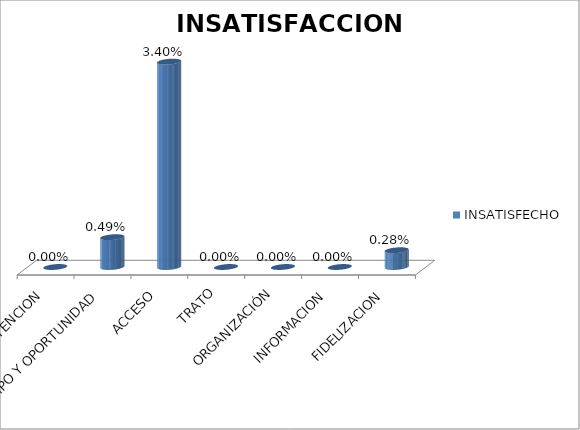
| Category | INSATISFECHO |
|---|---|
| ATENCION | 0 |
| TIEMPO Y OPORTUNIDAD | 0.005 |
| ACCESO | 0.034 |
| TRATO | 0 |
| ORGANIZACIÓN | 0 |
| INFORMACION | 0 |
| FIDELIZACION | 0.003 |